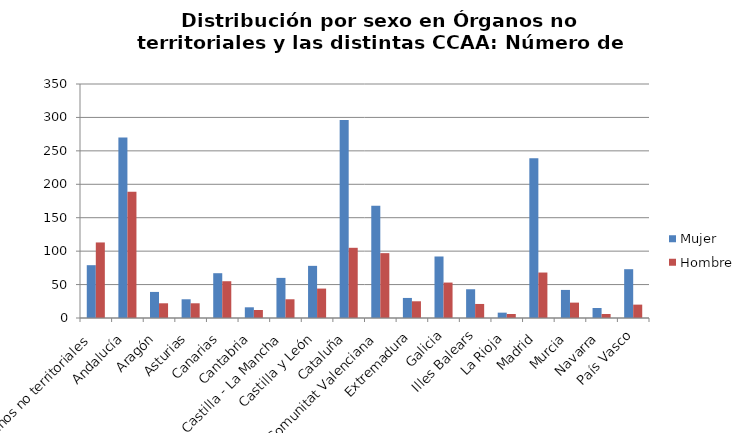
| Category | Mujer | Hombre |
|---|---|---|
| Órganos no territoriales | 79 | 113 |
| Andalucía | 270 | 189 |
| Aragón | 39 | 22 |
| Asturias | 28 | 22 |
| Canarias | 67 | 55 |
| Cantabria | 16 | 12 |
| Castilla - La Mancha | 60 | 28 |
| Castilla y León | 78 | 44 |
| Cataluña | 296 | 105 |
| Comunitat Valenciana | 168 | 97 |
| Extremadura | 30 | 25 |
| Galicia | 92 | 53 |
| Illes Balears | 43 | 21 |
| La Rioja | 8 | 6 |
| Madrid | 239 | 68 |
| Murcia | 42 | 23 |
| Navarra | 15 | 6 |
| País Vasco | 73 | 20 |